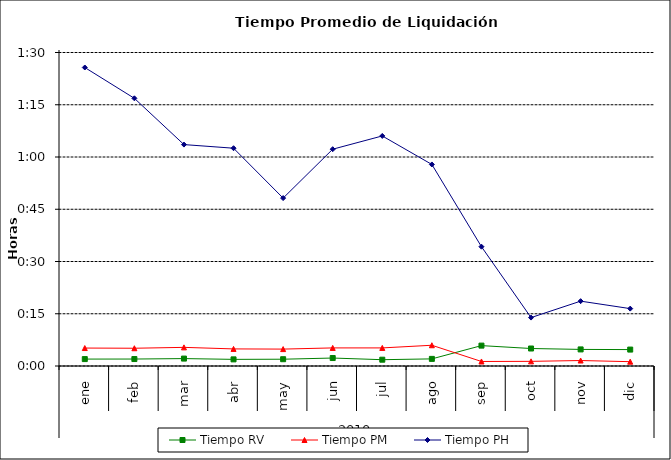
| Category | Tiempo RV | Tiempo PM | Tiempo PH |
|---|---|---|---|
| 0 | 0.001 | 0.004 | 0.06 |
| 1 | 0.001 | 0.004 | 0.053 |
| 2 | 0.001 | 0.004 | 0.044 |
| 3 | 0.001 | 0.003 | 0.043 |
| 4 | 0.001 | 0.003 | 0.033 |
| 5 | 0.002 | 0.004 | 0.043 |
| 6 | 0.001 | 0.004 | 0.046 |
| 7 | 0.001 | 0.004 | 0.04 |
| 8 | 0.004 | 0.001 | 0.024 |
| 9 | 0.003 | 0.001 | 0.01 |
| 10 | 0.003 | 0.001 | 0.013 |
| 11 | 0.003 | 0.001 | 0.011 |